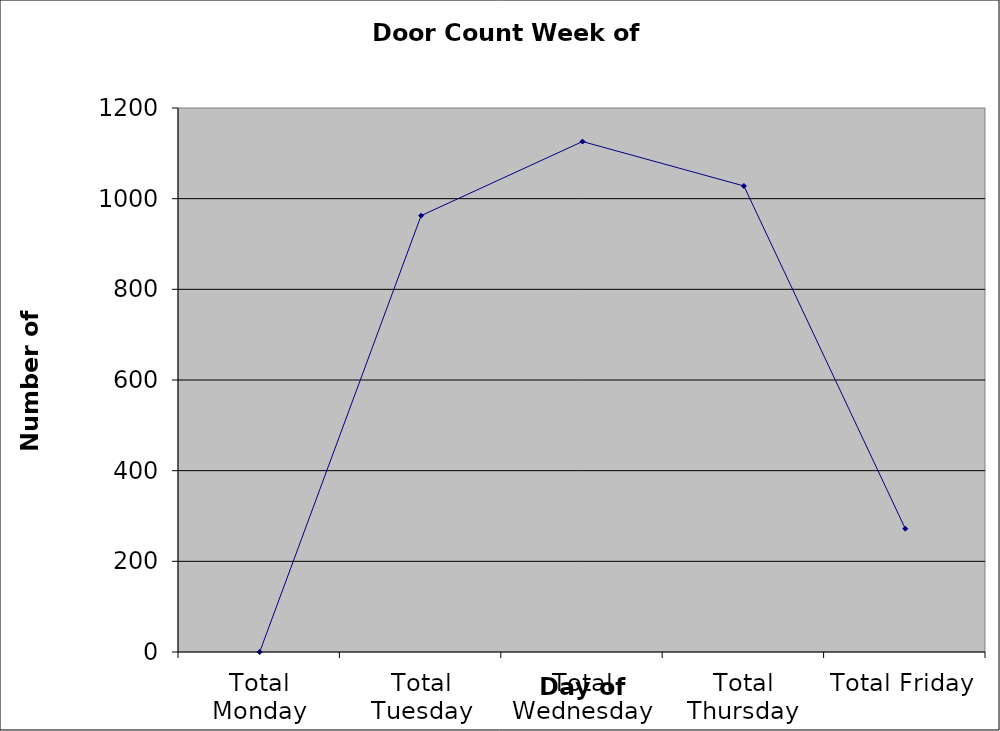
| Category | Series 0 |
|---|---|
| Total Monday | 0 |
| Total Tuesday | 962.5 |
| Total Wednesday | 1126 |
| Total Thursday | 1028 |
| Total Friday | 272 |